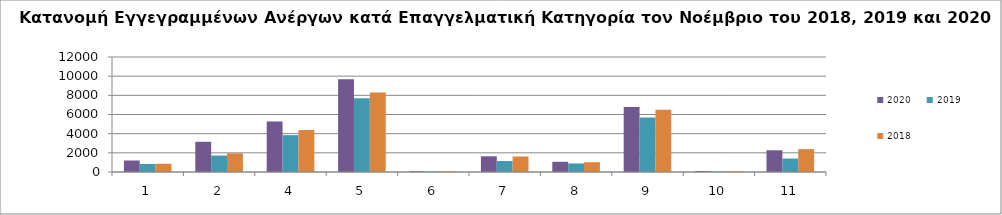
| Category | 2020 | 2019 | 2018 |
|---|---|---|---|
| 1.0 | 1200 | 840 | 859 |
| 2.0 | 3154 | 1719 | 1946 |
| 4.0 | 5273 | 3843 | 4379 |
| 5.0 | 9667 | 7692 | 8291 |
| 6.0 | 70 | 54 | 80 |
| 7.0 | 1638 | 1144 | 1617 |
| 8.0 | 1066 | 893 | 1019 |
| 9.0 | 6779 | 5690 | 6493 |
| 10.0 | 92 | 48 | 76 |
| 11.0 | 2268 | 1402 | 2384 |